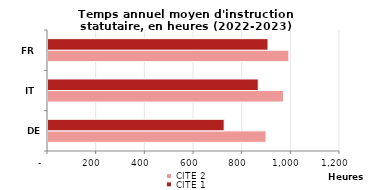
| Category | CITE 2 | CITE 1 |
|---|---|---|
| DE | 895.967 | 724.003 |
| IT | 968 | 864 |
| FR | 990 | 904.2 |